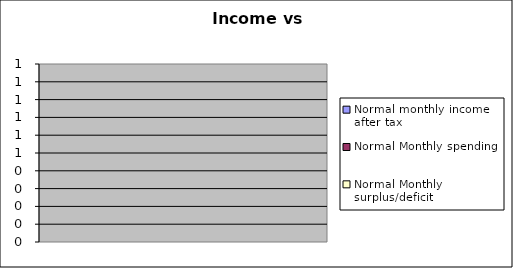
| Category | Normal monthly income after tax | Normal Monthly spending | Normal Monthly surplus/deficit |
|---|---|---|---|
| 0 |  | 0 | 0 |